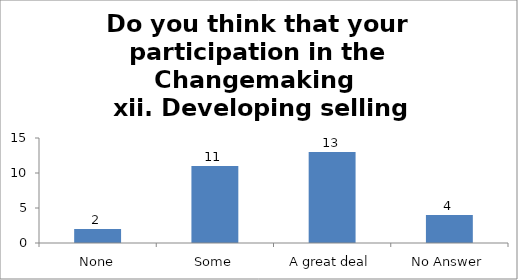
| Category | Do you think that your participation in the Changemaking 
 xii. Developing selling skills. |
|---|---|
| None | 2 |
| Some | 11 |
| A great deal | 13 |
| No Answer | 4 |